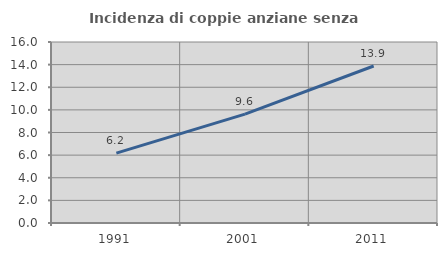
| Category | Incidenza di coppie anziane senza figli  |
|---|---|
| 1991.0 | 6.172 |
| 2001.0 | 9.624 |
| 2011.0 | 13.881 |